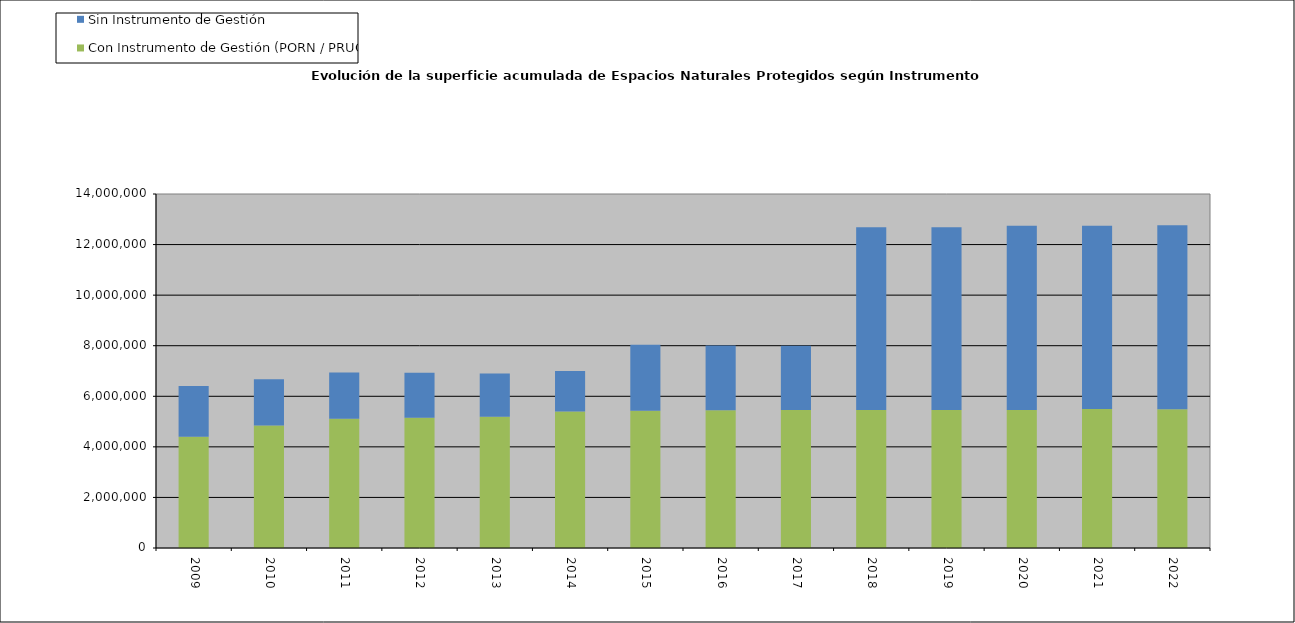
| Category | Con Instrumento de Gestión (PORN / PRUG) | Sin Instrumento de Gestión |
|---|---|---|
| 2009.0 | 4395015.389 | 2016449.15 |
| 2010.0 | 4843131.578 | 1833757.14 |
| 2011.0 | 5109748.061 | 1831920.18 |
| 2012.0 | 5152357.285 | 1775935.99 |
| 2013.0 | 5192144.996 | 1712428.77 |
| 2014.0 | 5399275.751 | 1598299.22 |
| 2015.0 | 5425392.76 | 2612731.19 |
| 2016.0 | 5447431.371 | 2564397.27 |
| 2017.0 | 5454822.808 | 2546575.8 |
| 2018.0 | 5459295.274 | 7228863.44 |
| 2019.0 | 5459295.274 | 7229037.13 |
| 2020.0 | 5459295.274 | 7281073.85 |
| 2021.0 | 5492304.463 | 7252660.721 |
| 2022.0 | 5484542.15 | 7280844.07 |